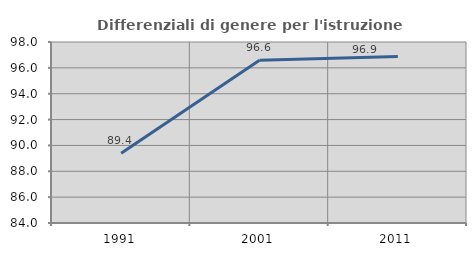
| Category | Differenziali di genere per l'istruzione superiore |
|---|---|
| 1991.0 | 89.39 |
| 2001.0 | 96.584 |
| 2011.0 | 96.876 |